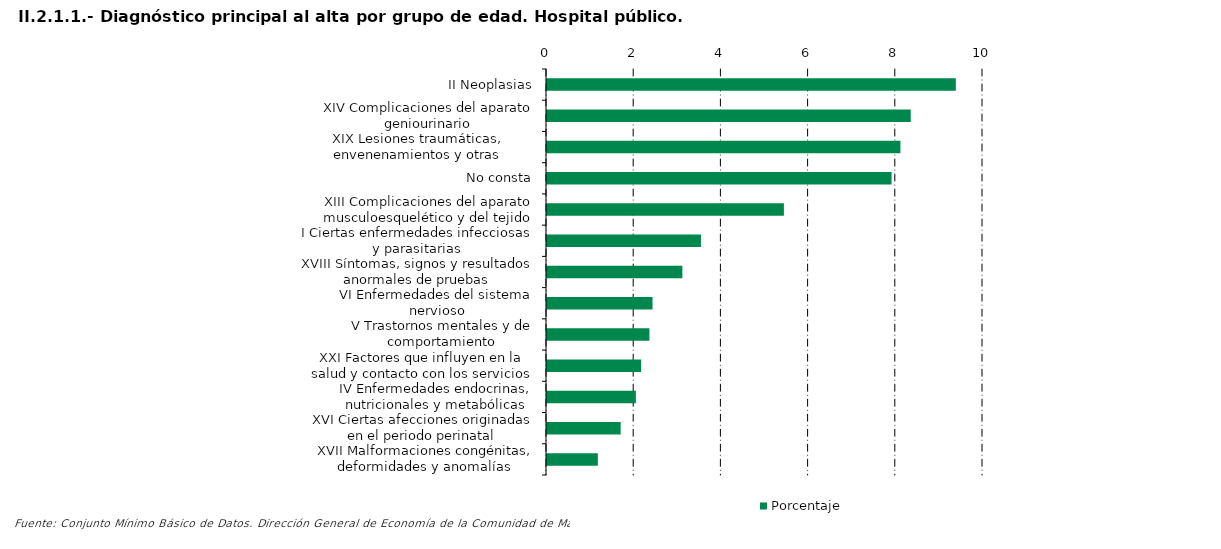
| Category | Porcentaje |
|---|---|
| II Neoplasias | 9.376 |
| XIV Complicaciones del aparato geniourinario | 8.342 |
| XIX Lesiones traumáticas, envenenamientos y otras consecuencias de causas externas | 8.106 |
| No consta | 7.903 |
| XIII Complicaciones del aparato musculoesquelético y del tejido conectivo | 5.434 |
| I Ciertas enfermedades infecciosas y parasitarias | 3.531 |
| XVIII Síntomas, signos y resultados anormales de pruebas complementarias, no clasificados bajo otro concepto | 3.105 |
| VI Enfermedades del sistema nervioso | 2.42 |
| V Trastornos mentales y de comportamiento | 2.35 |
| XXI Factores que influyen en la salud y contacto con los servicios sanitarios | 2.159 |
| IV Enfermedades endocrinas, nutricionales y metabólicas | 2.039 |
| XVI Ciertas afecciones originadas en el periodo perinatal | 1.69 |
| XVII Malformaciones congénitas, deformidades y anomalías cromosómicas | 1.166 |